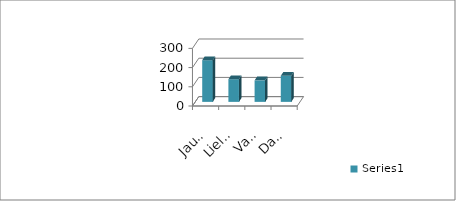
| Category | Series 0 |
|---|---|
| Jaunķemeri | 217 |
| Lielupes ieteka | 118 |
| Vakarbuļļi | 112 |
| Daugavgrīva | 136 |